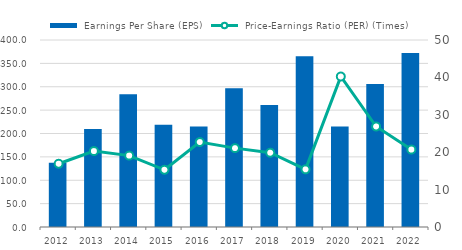
| Category |  Earnings Per Share (EPS) |
|---|---|
| 2012.0 | 137.2 |
| 2013.0 | 209.82 |
| 2014.0 | 283.89 |
| 2015.0 | 218.95 |
| 2016.0 | 215.09 |
| 2017.0 | 296.85 |
| 2018.0 | 260.78 |
| 2019.0 | 365.26 |
| 2020.0 | 214.72 |
| 2021.0 | 305.65 |
| 2022.0 | 372.2 |